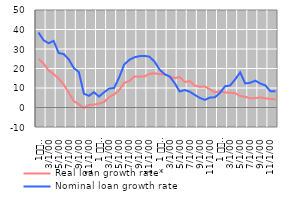
| Category | Real loan growth rate* | Nominal loan growth rate |
|---|---|---|
| 1
2009 | 24.971 | 38.434 |
| 2 | 22.527 | 34.499 |
| 3 | 18.975 | 32.953 |
| 4 | 17.157 | 34.161 |
| 5 | 14.745 | 27.918 |
| 6 | 11.805 | 27.403 |
| 7 | 7.496 | 24.646 |
| 8 | 3.243 | 20.261 |
| 9 | 1.655 | 18.17 |
| 10 | -0.331 | 7.08 |
| 11 | 1.319 | 5.983 |
| 12 | 1.443 | 7.836 |
| 1 
2010 | 2.002 | 5.626 |
| 2 | 2.806 | 7.796 |
| 3 | 5.321 | 9.674 |
| 4 | 6.719 | 10.046 |
| 5 | 8.845 | 15.496 |
| 6 | 12.692 | 22.044 |
| 7 | 13.555 | 24.414 |
| 8 | 15.914 | 25.72 |
| 9 | 15.949 | 26.33 |
| 10 | 15.955 | 26.467 |
| 11 | 17.247 | 26.058 |
| 12 | 17.569 | 23.568 |
| 1 
2011 | 17.067 | 19.491 |
| 2 | 17.037 | 17.078 |
| 3 | 15.895 | 15.921 |
| 4 | 15.085 | 12.529 |
| 5 | 15.631 | 8.217 |
| 6 | 13.081 | 8.949 |
| 7 | 13.533 | 8.103 |
| 8 | 11.206 | 6.448 |
| 9 | 10.604 | 4.927 |
| 10 | 10.773 | 3.903 |
| 11 | 9.325 | 5.091 |
| 12 | 7.737 | 5.245 |
| 1 
2012 | 8.298 | 7.55 |
| 2 | 7.661 | 10.867 |
| 3 | 7.578 | 11.26 |
| 4 | 7.372 | 14.416 |
| 5 | 5.872 | 17.997 |
| 6 | 5.513 | 12.307 |
| 7 | 4.735 | 12.694 |
| 8 | 4.823 | 13.752 |
| 9 | 5.156 | 12.307 |
| 10 | 4.7 | 11.342 |
| 11 | 4.389 | 8.282 |
| 12 | 4.157 | 8.383 |